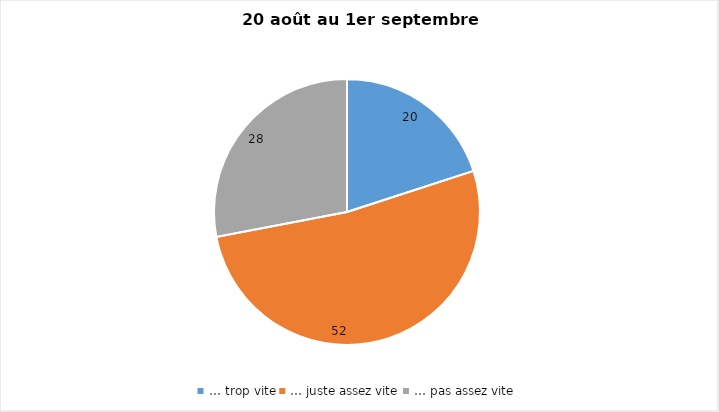
| Category | Series 0 |
|---|---|
| … trop vite | 20 |
| … juste assez vite | 52 |
| … pas assez vite | 28 |